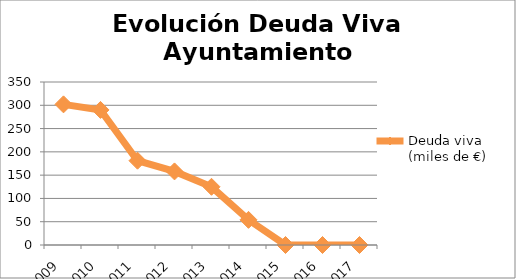
| Category | Deuda viva (miles de €) |
|---|---|
| 2009.0 | 302 |
| 2010.0 | 290 |
| 2011.0 | 181 |
| 2012.0 | 158 |
| 2013.0 | 125 |
| 2014.0 | 54 |
| 2015.0 | 0 |
| 2016.0 | 0 |
| 2017.0 | 0 |